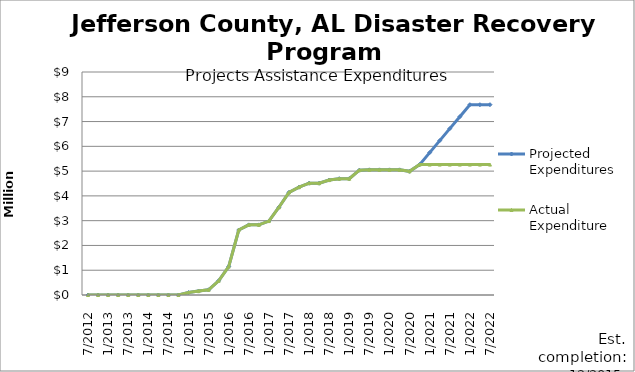
| Category | Projected Expenditures | Actual Expenditure |
|---|---|---|
| 7/2012 | 0 | 0 |
| 10/2012 | 0 | 0 |
| 1/2013 | 0 | 0 |
| 4/2013 | 0 | 0 |
| 7/2013 | 0 | 0 |
| 10/2013 | 0 | 0 |
| 1/2014 | 0 | 0 |
| 4/2014 | 0 | 0 |
| 7/2014 | 0 | 0 |
| 10/2014 | 0 | 0 |
| 1/2015 | 99593 | 99592.89 |
| 4/2015 | 157286 | 157286.27 |
| 7/2015 | 209659 | 209659.14 |
| 10/2015 | 574741 | 574740.64 |
| 1/2016 | 1148038 | 1148038 |
| 4/2016 | 2622147 | 2622147.11 |
| 7/2016 | 2830687 | 2830686.77 |
| 10/2016 | 2830687 | 2830686.77 |
| 1/2017 | 2984837 | 2984836.68 |
| 4/2017 | 3541383 | 3541382.2 |
| 7/2017 | 4142058 | 4142056.9 |
| 10/2017 | 4352664 | 4352662.94 |
| 1/2018 | 4512504 | 4512502.91 |
| 4/2018 | 4512504 | 4512502.91 |
| 7/2018 | 4638946 | 4638945.35 |
| 10/2018 | 4694047 | 4694046.33 |
| 1/2019 | 4694047 | 4694046.33 |
| 4/2019 | 5037974 | 5037973.28 |
| 7/2019 | 5051518 | 5051517.08 |
| 10/2019 | 5051518 | 5051517.08 |
| 1/2020 | 5051518 | 5051517.08 |
| 4/2020 | 5051518 | 5051517.08 |
| 7/2020 | 4990269 | 4990268.46 |
| 10/2020 | 5262963 | 5262962.04 |
| 1/2021 | 5746421.85 | 5262962.04 |
| 4/2021 | 6229880.7 | 5262962.04 |
| 7/2021 | 6713339.55 | 5262962.04 |
| 10/2021 | 7196798.4 | 5262962.04 |
| 1/2022 | 7680257.25 | 5262962.04 |
| 4/2022 | 7680257.25 | 5262962.04 |
| 7/2022 | 7680257.25 | 5262962.04 |